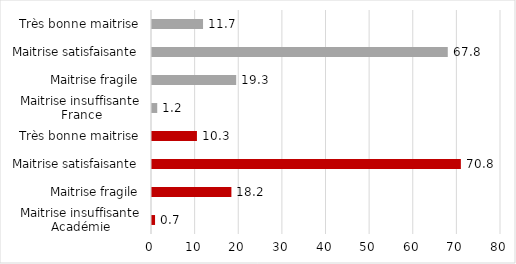
| Category | Series 0 |
|---|---|
| 0 | 0.7 |
| 1 | 18.2 |
| 2 | 70.8 |
| 3 | 10.3 |
| 4 | 1.2 |
| 5 | 19.3 |
| 6 | 67.8 |
| 7 | 11.7 |